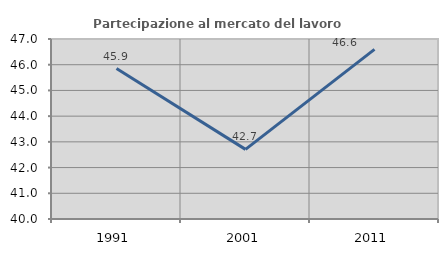
| Category | Partecipazione al mercato del lavoro  femminile |
|---|---|
| 1991.0 | 45.851 |
| 2001.0 | 42.708 |
| 2011.0 | 46.595 |